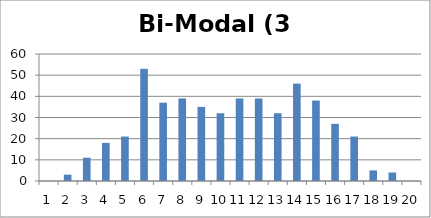
| Category | Bi-Modal (3 dice) |
|---|---|
| 0 | 0 |
| 1 | 3 |
| 2 | 11 |
| 3 | 18 |
| 4 | 21 |
| 5 | 53 |
| 6 | 37 |
| 7 | 39 |
| 8 | 35 |
| 9 | 32 |
| 10 | 39 |
| 11 | 39 |
| 12 | 32 |
| 13 | 46 |
| 14 | 38 |
| 15 | 27 |
| 16 | 21 |
| 17 | 5 |
| 18 | 4 |
| 19 | 0 |